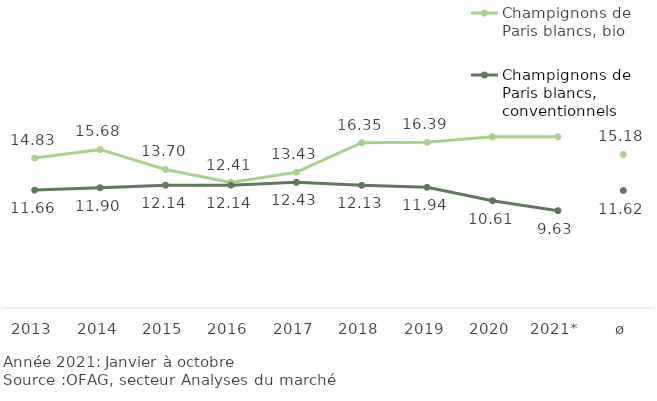
| Category | Champignons de Paris blancs, bio | Champignons de Paris blancs, conventionnels |
|---|---|---|
| 2013 | 14.828 | 11.661 |
| 2014 | 15.682 | 11.897 |
| 2015 | 13.703 | 12.14 |
| 2016 | 12.406 | 12.144 |
| 2017 | 13.428 | 12.432 |
| 2018 | 16.348 | 12.131 |
| 2019 | 16.387 | 11.936 |
| 2020 | 16.93 | 10.61 |
| 2021* | 16.928 | 9.625 |
| ø | 15.182 | 11.619 |